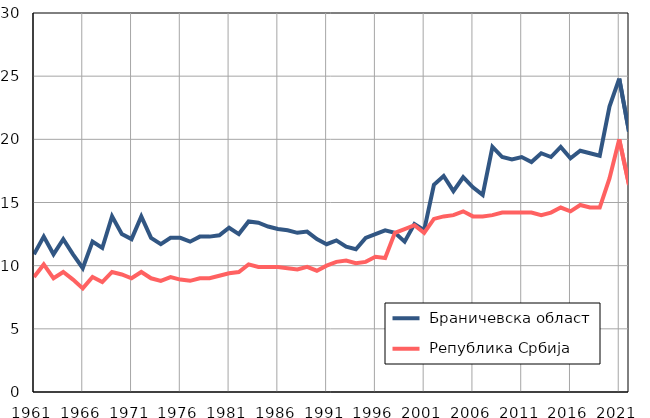
| Category |  Браничевска област |  Република Србија |
|---|---|---|
| 1961.0 | 10.9 | 9.1 |
| 1962.0 | 12.3 | 10.1 |
| 1963.0 | 10.9 | 9 |
| 1964.0 | 12.1 | 9.5 |
| 1965.0 | 10.9 | 8.9 |
| 1966.0 | 9.8 | 8.2 |
| 1967.0 | 11.9 | 9.1 |
| 1968.0 | 11.4 | 8.7 |
| 1969.0 | 13.9 | 9.5 |
| 1970.0 | 12.5 | 9.3 |
| 1971.0 | 12.1 | 9 |
| 1972.0 | 13.9 | 9.5 |
| 1973.0 | 12.2 | 9 |
| 1974.0 | 11.7 | 8.8 |
| 1975.0 | 12.2 | 9.1 |
| 1976.0 | 12.2 | 8.9 |
| 1977.0 | 11.9 | 8.8 |
| 1978.0 | 12.3 | 9 |
| 1979.0 | 12.3 | 9 |
| 1980.0 | 12.4 | 9.2 |
| 1981.0 | 13 | 9.4 |
| 1982.0 | 12.5 | 9.5 |
| 1983.0 | 13.5 | 10.1 |
| 1984.0 | 13.4 | 9.9 |
| 1985.0 | 13.1 | 9.9 |
| 1986.0 | 12.9 | 9.9 |
| 1987.0 | 12.8 | 9.8 |
| 1988.0 | 12.6 | 9.7 |
| 1989.0 | 12.7 | 9.9 |
| 1990.0 | 12.1 | 9.6 |
| 1991.0 | 11.7 | 10 |
| 1992.0 | 12 | 10.3 |
| 1993.0 | 11.5 | 10.4 |
| 1994.0 | 11.3 | 10.2 |
| 1995.0 | 12.2 | 10.3 |
| 1996.0 | 12.5 | 10.7 |
| 1997.0 | 12.8 | 10.6 |
| 1998.0 | 12.6 | 12.6 |
| 1999.0 | 11.9 | 12.9 |
| 2000.0 | 13.3 | 13.2 |
| 2001.0 | 12.8 | 12.6 |
| 2002.0 | 16.4 | 13.7 |
| 2003.0 | 17.1 | 13.9 |
| 2004.0 | 15.9 | 14 |
| 2005.0 | 17 | 14.3 |
| 2006.0 | 16.2 | 13.9 |
| 2007.0 | 15.6 | 13.9 |
| 2008.0 | 19.4 | 14 |
| 2009.0 | 18.6 | 14.2 |
| 2010.0 | 18.4 | 14.2 |
| 2011.0 | 18.6 | 14.2 |
| 2012.0 | 18.2 | 14.2 |
| 2013.0 | 18.9 | 14 |
| 2014.0 | 18.6 | 14.2 |
| 2015.0 | 19.4 | 14.6 |
| 2016.0 | 18.5 | 14.3 |
| 2017.0 | 19.1 | 14.8 |
| 2018.0 | 18.9 | 14.6 |
| 2019.0 | 18.7 | 14.6 |
| 2020.0 | 22.6 | 16.9 |
| 2021.0 | 24.8 | 20 |
| 2022.0 | 20.6 | 16.4 |